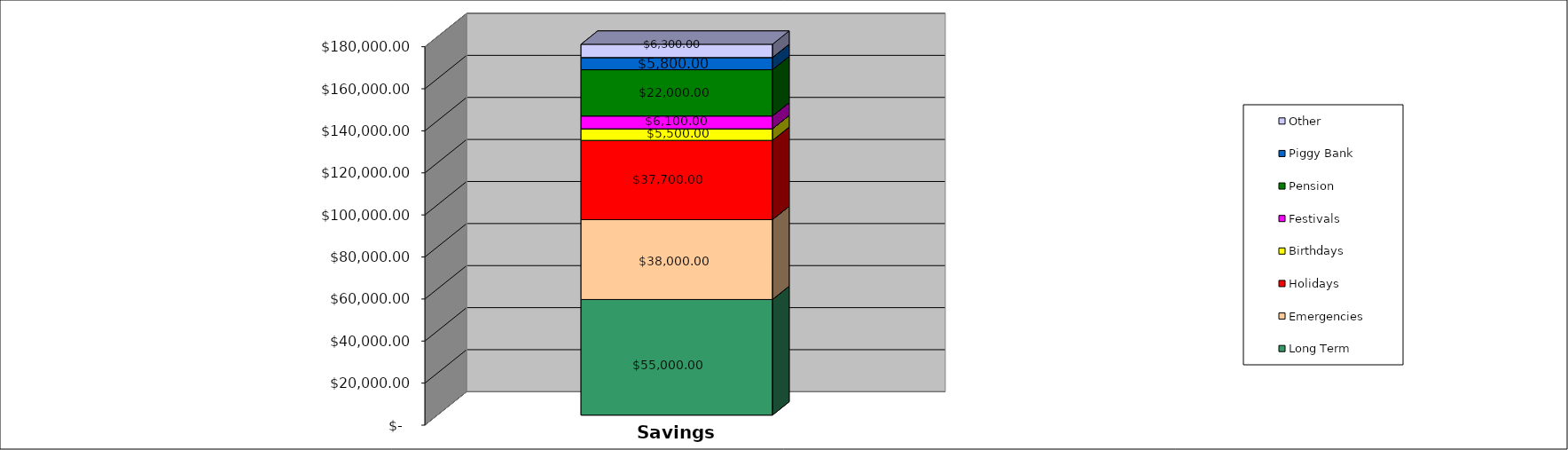
| Category | Long Term | Emergencies | Holidays | Birthdays | Festivals | Pension | Piggy Bank | Other |
|---|---|---|---|---|---|---|---|---|
| 0 | 55000 | 38000 | 37700 | 5500 | 6100 | 22000 | 5800 | 6300 |